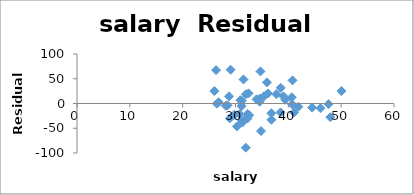
| Category | Series 0 |
|---|---|
| 31.144 | -5.287 |
| 47.951 | -27.71 |
| 32.175 | -27.822 |
| 28.934 | -29.937 |
| 41.078 | -18.301 |
| 34.571 | 3.713 |
| 50.045 | 25.153 |
| 39.076 | 14.484 |
| 32.588 | -23.624 |
| 32.291 | -21.33 |
| 38.518 | -18.107 |
| 29.783 | -22.605 |
| 39.431 | 7.591 |
| 36.785 | -19.626 |
| 31.511 | 48.541 |
| 34.652 | 9.929 |
| 32.257 | -30.316 |
| 26.461 | -0.277 |
| 31.972 | 18.626 |
| 40.661 | 12.641 |
| 40.795 | 46.705 |
| 41.895 | -6.535 |
| 35.948 | 42.756 |
| 26.818 | 2.493 |
| 31.189 | 5.624 |
| 28.785 | 14.432 |
| 30.922 | 6.666 |
| 34.836 | -55.658 |
| 34.72 | 64.79 |
| 46.087 | -9.575 |
| 28.493 | -3.781 |
| 47.612 | -1.319 |
| 30.793 | -21.537 |
| 26.327 | 67.453 |
| 36.802 | -32.813 |
| 28.172 | -4.675 |
| 38.555 | 31.597 |
| 44.51 | -8.24 |
| 40.729 | -1.724 |
| 30.279 | -46.123 |
| 25.994 | 25.127 |
| 32.477 | 20.459 |
| 31.223 | -34.827 |
| 29.082 | 68.262 |
| 35.406 | 14.861 |
| 33.987 | 8.454 |
| 36.151 | 20.385 |
| 31.944 | -89.244 |
| 37.746 | 18.743 |
| 31.285 | -38.491 |